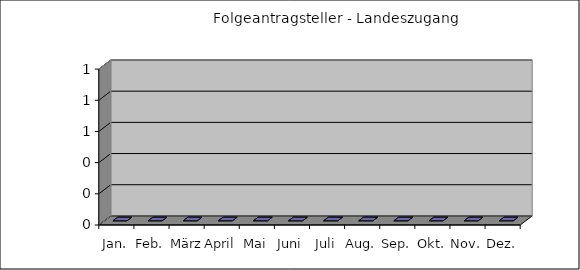
| Category | Folge-
anträge |
|---|---|
| Jan. | 0 |
| Feb. | 0 |
| März | 0 |
| April | 0 |
| Mai | 0 |
| Juni | 0 |
| Juli | 0 |
| Aug. | 0 |
| Sep. | 0 |
| Okt. | 0 |
| Nov. | 0 |
| Dez. | 0 |